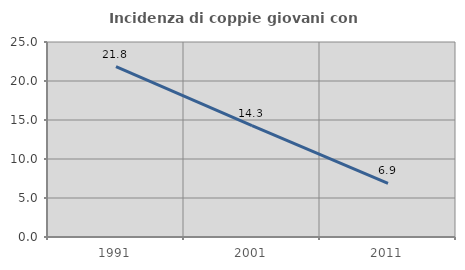
| Category | Incidenza di coppie giovani con figli |
|---|---|
| 1991.0 | 21.842 |
| 2001.0 | 14.286 |
| 2011.0 | 6.869 |